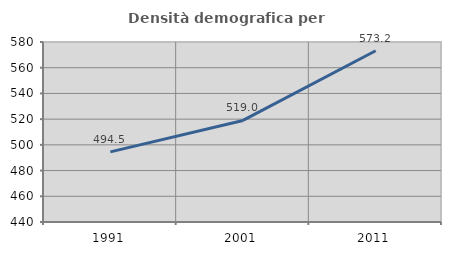
| Category | Densità demografica |
|---|---|
| 1991.0 | 494.537 |
| 2001.0 | 518.998 |
| 2011.0 | 573.187 |